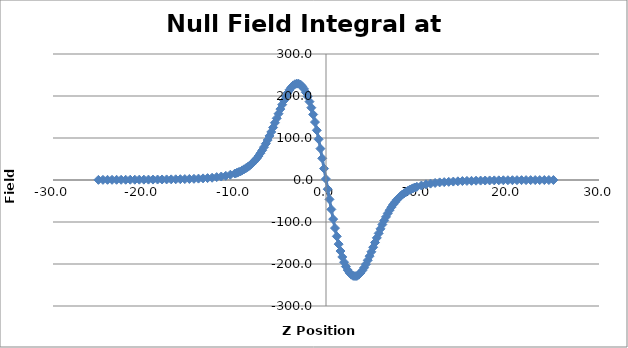
| Category | Series 0 |
|---|---|
| -25.011000000000003 | 0.35 |
| -24.512000000000004 | 0.403 |
| -24.008000000000003 | 0.447 |
| -23.511000000000003 | 0.451 |
| -23.013 | 0.485 |
| -22.511000000000003 | 0.522 |
| -22.013 | 0.569 |
| -21.511000000000003 | 0.64 |
| -21.011000000000003 | 0.696 |
| -20.515000000000004 | 0.769 |
| -20.013 | 0.833 |
| -19.512000000000004 | 0.905 |
| -19.012000000000004 | 0.991 |
| -18.510000000000005 | 1.096 |
| -18.014000000000003 | 1.228 |
| -17.513 | 1.358 |
| -17.012000000000004 | 1.511 |
| -16.513 | 1.701 |
| -16.010000000000005 | 1.898 |
| -15.513000000000002 | 2.17 |
| -15.016000000000002 | 2.462 |
| -14.511000000000003 | 2.839 |
| -14.012000000000004 | 3.288 |
| -13.510000000000005 | 3.853 |
| -13.012000000000004 | 4.526 |
| -12.516000000000005 | 5.363 |
| -12.011000000000003 | 6.886 |
| -11.511000000000003 | 8.295 |
| -11.012 | 9.945 |
| -10.512 | 12.547 |
| -10.015 | 15.419 |
| -9.813000000000002 | 16.96 |
| -9.612000000000002 | 18.649 |
| -9.412000000000006 | 20.336 |
| -9.213000000000001 | 22.905 |
| -9.011000000000003 | 25.407 |
| -8.810000000000002 | 27.949 |
| -8.611000000000004 | 30.803 |
| -8.413000000000004 | 33.877 |
| -8.211000000000006 | 37.723 |
| -8.011000000000003 | 41.829 |
| -7.814 | 46.41 |
| -7.615000000000002 | 51.168 |
| -7.4140000000000015 | 57 |
| -7.213000000000001 | 63.665 |
| -7.014000000000003 | 70.546 |
| -6.815000000000005 | 78.157 |
| -6.613000000000007 | 86.473 |
| -6.410000000000004 | 95.11 |
| -6.211000000000006 | 104.898 |
| -6.013000000000005 | 114.383 |
| -5.812000000000005 | 125.043 |
| -5.611000000000004 | 136.226 |
| -5.415000000000006 | 146.931 |
| -5.216000000000001 | 157.817 |
| -5.015000000000001 | 168.838 |
| -4.814 | 179.43 |
| -4.615000000000002 | 189.302 |
| -4.415000000000006 | 198.718 |
| -4.212000000000003 | 207.332 |
| -4.010000000000005 | 214.677 |
| -3.811 | 220.44 |
| -3.612000000000002 | 225.221 |
| -3.4110000000000014 | 228.045 |
| -3.210000000000001 | 229.354 |
| -3.0130000000000052 | 229.175 |
| -2.815000000000005 | 227.282 |
| -2.6140000000000043 | 222.993 |
| -2.413000000000004 | 216.796 |
| -2.2150000000000034 | 208.711 |
| -2.0150000000000006 | 198.545 |
| -1.8130000000000024 | 186.593 |
| -1.6110000000000042 | 172.197 |
| -1.4110000000000014 | 155.988 |
| -1.2120000000000033 | 137.952 |
| -1.0110000000000028 | 118.377 |
| -0.8100000000000023 | 97.008 |
| -0.6110000000000042 | 74.681 |
| -0.4140000000000015 | 51.606 |
| -0.21300000000000097 | 27.174 |
| -0.01300000000000523 | 2.496 |
| 0.18499999999999517 | -21.884 |
| 0.38399999999999324 | -46.13 |
| 0.5869999999999962 | -69.99 |
| 0.7889999999999944 | -93.184 |
| 0.9889999999999972 | -114.48 |
| 1.1879999999999953 | -134.217 |
| 1.3889999999999958 | -152.703 |
| 1.590999999999994 | -169.099 |
| 1.7899999999999991 | -183.292 |
| 1.9869999999999948 | -195.731 |
| 2.1869999999999976 | -206.046 |
| 2.387999999999998 | -214.447 |
| 2.5859999999999985 | -221.122 |
| 2.783999999999999 | -225.551 |
| 2.9869999999999948 | -228.268 |
| 3.189 | -228.687 |
| 3.388999999999996 | -228.407 |
| 3.586999999999996 | -225.681 |
| 3.7889999999999944 | -221.36 |
| 3.9909999999999997 | -215.485 |
| 4.189999999999998 | -208.693 |
| 4.386999999999993 | -200.598 |
| 4.587999999999994 | -191.111 |
| 4.788999999999994 | -181.325 |
| 4.986999999999995 | -170.885 |
| 5.184999999999995 | -160.15 |
| 5.386999999999993 | -148.844 |
| 5.587999999999994 | -137.765 |
| 5.787999999999997 | -127.028 |
| 5.986999999999995 | -116.263 |
| 6.189 | -106.054 |
| 6.3899999999999935 | -96.593 |
| 6.589999999999996 | -87.862 |
| 6.787999999999997 | -79.497 |
| 6.988999999999997 | -71.89 |
| 7.189 | -64.833 |
| 7.387999999999998 | -58.349 |
| 7.5859999999999985 | -52.681 |
| 7.786999999999999 | -47.279 |
| 7.9879999999999995 | -42.807 |
| 8.187999999999995 | -38.41 |
| 8.386999999999993 | -34.64 |
| 8.588999999999999 | -31.592 |
| 8.790999999999997 | -28.64 |
| 8.989999999999995 | -25.955 |
| 9.189 | -23.238 |
| 9.389999999999993 | -21.501 |
| 9.590999999999994 | -19.491 |
| 9.79 | -17.846 |
| 9.985999999999997 | -16.22 |
| 10.488 | -13.17 |
| 10.988999999999997 | -10.303 |
| 11.488999999999997 | -8.611 |
| 11.991 | -7.015 |
| 12.488 | -5.699 |
| 12.988 | -5.116 |
| 13.489999999999995 | -4.413 |
| 13.988999999999997 | -3.728 |
| 14.491999999999997 | -3.15 |
| 14.988999999999997 | -2.562 |
| 15.486999999999995 | -2.192 |
| 15.989999999999995 | -1.947 |
| 16.488999999999997 | -1.659 |
| 16.991 | -1.441 |
| 17.489999999999995 | -1.237 |
| 17.985 | -1.061 |
| 18.489999999999995 | -0.911 |
| 18.988999999999997 | -0.76 |
| 19.488 | -0.647 |
| 19.989999999999995 | -0.574 |
| 20.48599999999999 | -0.501 |
| 20.98899999999999 | -0.419 |
| 21.489999999999995 | -0.352 |
| 21.988 | -0.298 |
| 22.491 | -0.242 |
| 22.988 | -0.214 |
| 23.486999999999995 | -0.169 |
| 23.991 | -0.122 |
| 24.48899999999999 | -0.067 |
| 24.991 | -0.059 |